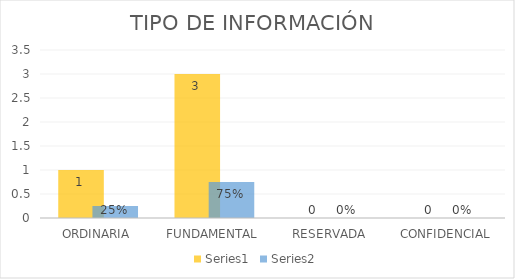
| Category | Series 3 | Series 4 |
|---|---|---|
| ORDINARIA | 1 | 0.25 |
| FUNDAMENTAL | 3 | 0.75 |
| RESERVADA | 0 | 0 |
| CONFIDENCIAL | 0 | 0 |